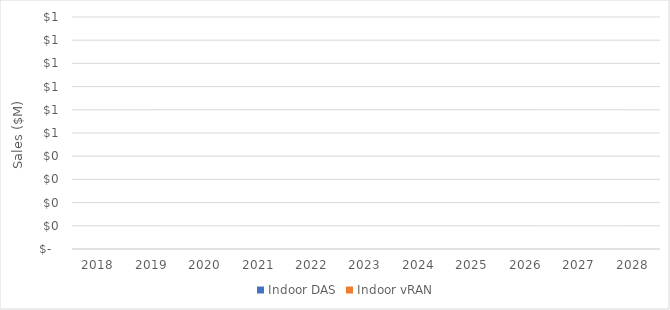
| Category | Indoor DAS | Indoor vRAN |
|---|---|---|
| 2018.0 | 0 | 0 |
| 2019.0 | 0 | 0 |
| 2020.0 | 0 | 0 |
| 2021.0 | 0 | 0 |
| 2022.0 | 0 | 0 |
| 2023.0 | 0 | 0 |
| 2024.0 | 0 | 0 |
| 2025.0 | 0 | 0 |
| 2026.0 | 0 | 0 |
| 2027.0 | 0 | 0 |
| 2028.0 | 0 | 0 |